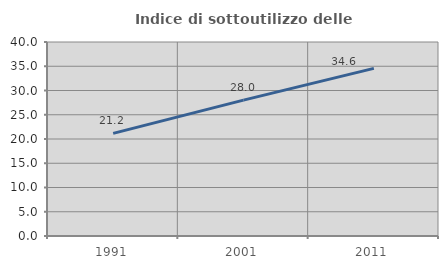
| Category | Indice di sottoutilizzo delle abitazioni  |
|---|---|
| 1991.0 | 21.151 |
| 2001.0 | 28.007 |
| 2011.0 | 34.566 |